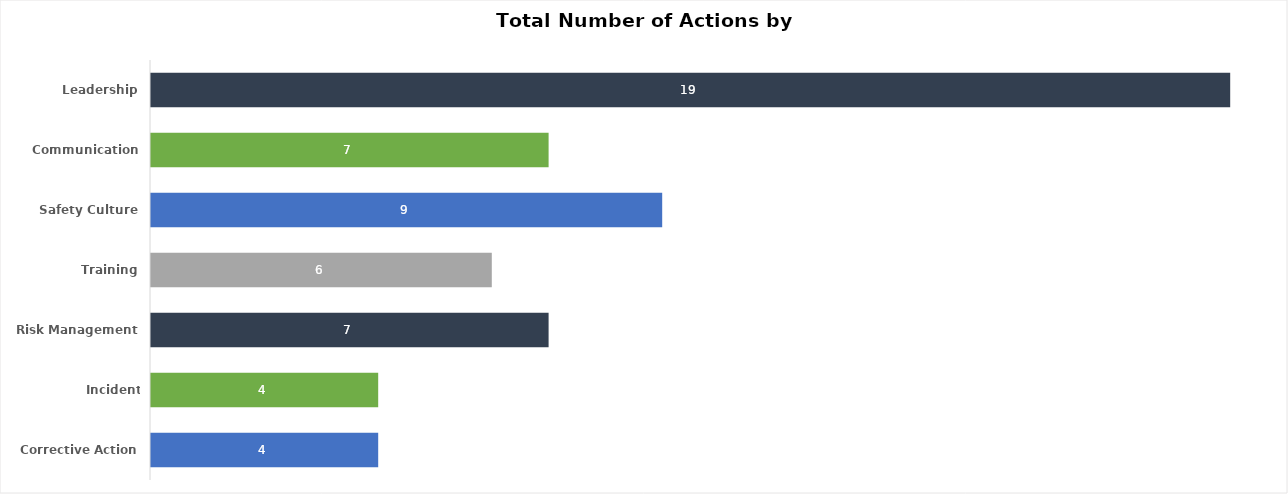
| Category | Number of Actions |
|---|---|
| 0 | 4 |
| 1 | 4 |
| 2 | 7 |
| 3 | 6 |
| 4 | 9 |
| 5 | 7 |
| 6 | 19 |